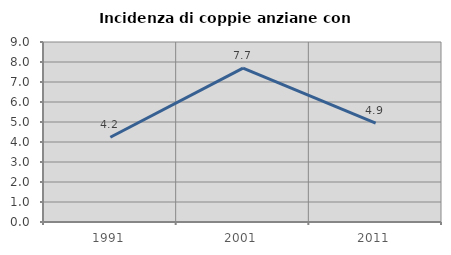
| Category | Incidenza di coppie anziane con figli |
|---|---|
| 1991.0 | 4.237 |
| 2001.0 | 7.692 |
| 2011.0 | 4.938 |